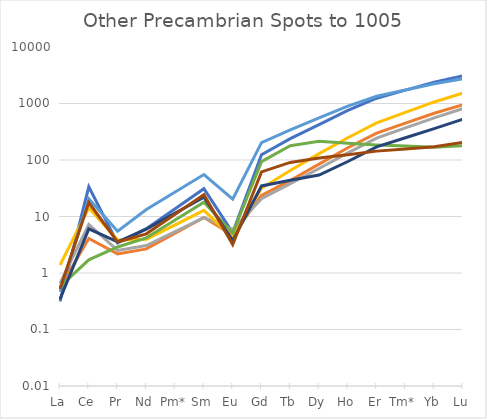
| Category | Series 0 | Series 1 | Series 2 | Series 3 | Series 4 | Series 5 | Series 6 | Series 7 |
|---|---|---|---|---|---|---|---|---|
| La | 0.314 | 0.555 | 0.654 | 1.385 | 0.463 | 0.576 | 0.344 | 0.52 |
| Ce | 33.59 | 4.086 | 7.234 | 14.26 | 20.554 | 1.708 | 6.051 | 17.637 |
| Pr | 3.387 | 2.179 | 2.515 | 3.847 | 5.496 | 2.885 | 3.571 | 3.549 |
| Nd | 6.089 | 2.674 | 3.059 | 3.937 | 13.261 | 4.186 | 5.981 | 4.935 |
| Pm* | 13.75 | 5.067 | 5.405 | 7.11 | 27.056 | 8.676 | 11.449 | 10.969 |
| Sm | 31.049 | 9.602 | 9.551 | 12.839 | 55.198 | 17.98 | 21.916 | 24.385 |
| Eu | 5.156 | 4.721 | 5.935 | 4.2 | 20.311 | 5.103 | 3.741 | 3.201 |
| Gd | 124.025 | 23.501 | 20.638 | 31.581 | 202.7 | 93.694 | 34.751 | 61.497 |
| Tb | 239.025 | 43.474 | 38.289 | 65.044 | 340.536 | 179.065 | 43.795 | 90.613 |
| Dy | 421.995 | 84.649 | 70.781 | 129.611 | 559.167 | 213.868 | 54.149 | 108.182 |
| Ho | 754.224 | 164.62 | 133.489 | 247.714 | 899.818 | 196.943 | 94.056 | 123.514 |
| Er | 1242.09 | 298.904 | 244.544 | 454.178 | 1345.24 | 184.78 | 170.529 | 143.598 |
| Tm* | 1721.807 | 448.181 | 369.137 | 695.518 | 1734.929 | 176.063 | 247.491 | 156.896 |
| Yb | 2386.798 | 672.01 | 557.211 | 1065.101 | 2237.505 | 167.757 | 359.188 | 171.425 |
| Lu | 3098.7 | 952.137 | 812.82 | 1527.798 | 2737.131 | 179.509 | 528.408 | 205.186 |